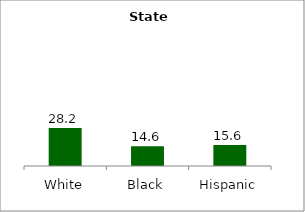
| Category | Series 0 |
|---|---|
| White | 28.21 |
| Black | 14.586 |
| Hispanic | 15.646 |